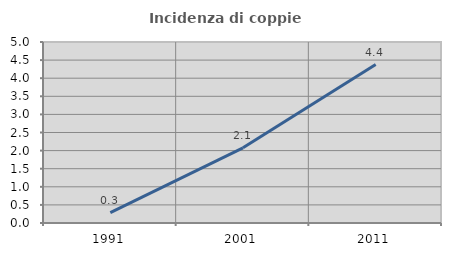
| Category | Incidenza di coppie miste |
|---|---|
| 1991.0 | 0.288 |
| 2001.0 | 2.077 |
| 2011.0 | 4.376 |